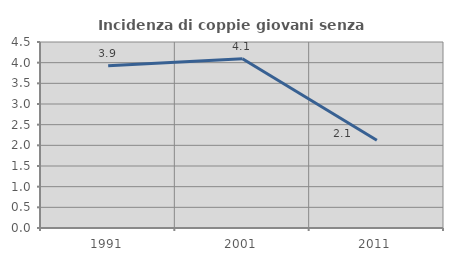
| Category | Incidenza di coppie giovani senza figli |
|---|---|
| 1991.0 | 3.925 |
| 2001.0 | 4.097 |
| 2011.0 | 2.125 |